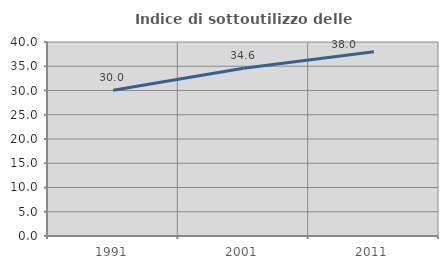
| Category | Indice di sottoutilizzo delle abitazioni  |
|---|---|
| 1991.0 | 30.032 |
| 2001.0 | 34.598 |
| 2011.0 | 37.996 |